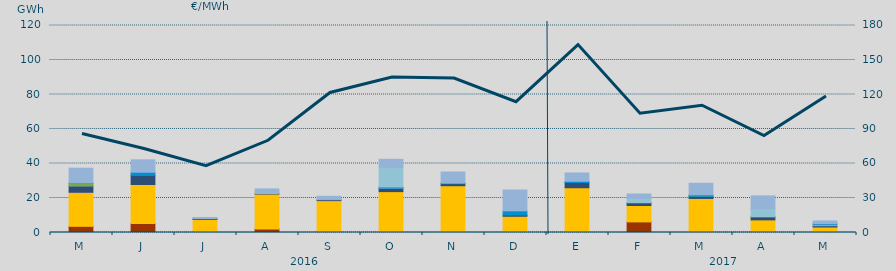
| Category | Carbón | Ciclo Combinado | Cogeneración | Consumo Bombeo | Enlace Península Baleares | Eólica | Hidráulica | Internacionales | Otras Renovables | Residuos no Renovables | Solar fotovoltaica | Solar térmica | Turbinación bombeo |
|---|---|---|---|---|---|---|---|---|---|---|---|---|---|
| M | 3569.6 | 19753.8 | 10.4 | 3695 | 26 | 1500 | 196.5 | 0 | 0 | 0 | 0 | 0 | 8519.5 |
| J | 5205 | 22612.8 | 0 | 5244.3 | 0 | 0 | 1878.6 | 0 | 0 | 0 | 0 | 0 | 7187.7 |
| J | 210 | 7404.2 | 0 | 326.1 | 0 | 0 | 195.5 | 0 | 0 | 0 | 0 | 0 | 525.8 |
| A | 2091.8 | 20206 | 0 | 273.8 | 0 | 0 | 0 | 0 | 0 | 0 | 0 | 0 | 2688.1 |
| S | 456.3 | 18024.6 | 0 | 521.1 | 279.8 | 0 | 0 | 0 | 0 | 0 | 0 | 0 | 1707.9 |
| O | 53.4 | 23642.3 | 0 | 1821.5 | 200.8 | 0 | 661 | 11465.7 | 0 | 0 | 0 | 0 | 4580.4 |
| N | 0 | 27130.5 | 0 | 1183.5 | 0 | 0 | 312.1 | 0 | 0 | 0 | 0 | 0 | 6456 |
| D | 0 | 9410.5 | 0 | 701.1 | 0 | 0 | 2449.9 | 0 | 0 | 0 | 0 | 0 | 12070.5 |
| E | 0 | 25945.3 | 0 | 3031.3 | 0 | 0 | 733.3 | 0 | 0 | 0 | 0 | 0 | 4804 |
| F | 6150 | 9508.4 | 0 | 1469.4 | 0 | 0 | 198 | 2463.6 | 0 | 0 | 0 | 0 | 2519.7 |
| M | 0 | 19740.7 | 0 | 1177.9 | 20.4 | 43.7 | 849.6 | 0 | 0 | 0 | 0 | 0 | 6709.7 |
| A | 610 | 6714.7 | 0 | 1740 | 132.6 | 93.7 | 0 | 4549.7 | 0 | 0 | 0 | 0 | 7385.9 |
| M | 70 | 3116.9 | 0 | 762.7 | 846.6 | 0 | 410 | 0 | 0 | 0 | 0 | 0 | 1489.3 |